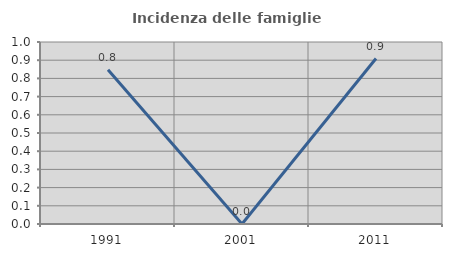
| Category | Incidenza delle famiglie numerose |
|---|---|
| 1991.0 | 0.847 |
| 2001.0 | 0 |
| 2011.0 | 0.909 |